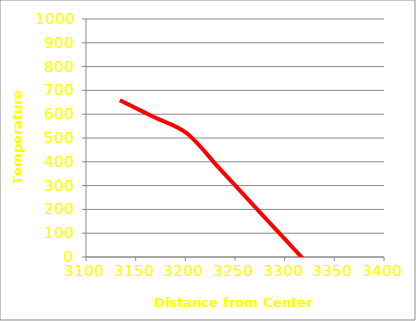
| Category | Series 0 |
|---|---|
| 3134.099999999996 | 658.49 |
| 3167.7999999999956 | 589.185 |
| 3201.4999999999955 | 519.88 |
| 3235.1999999999953 | 368.082 |
| 3268.899999999995 | 216.284 |
| 3302.599999999995 | 64.487 |
| 3336.2999999999947 | -87.311 |
| 3369.9999999999945 | -239.108 |